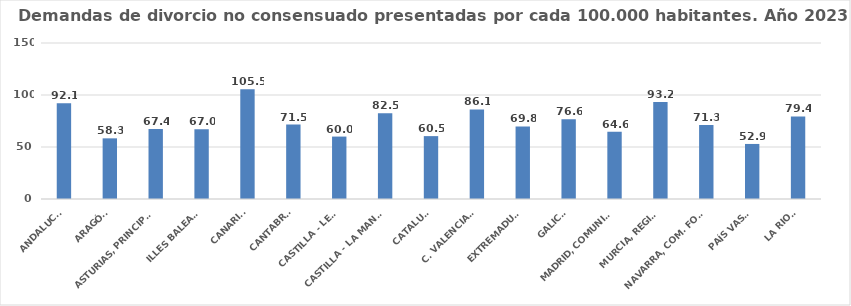
| Category | Series 0 |
|---|---|
| ANDALUCÍA | 92.074 |
| ARAGÓN | 58.325 |
| ASTURIAS, PRINCIPADO | 67.355 |
| ILLES BALEARS | 67.041 |
| CANARIAS | 105.517 |
| CANTABRIA | 71.534 |
| CASTILLA - LEÓN | 60.019 |
| CASTILLA - LA MANCHA | 82.523 |
| CATALUÑA | 60.463 |
| C. VALENCIANA | 86.121 |
| EXTREMADURA | 69.809 |
| GALICIA | 76.601 |
| MADRID, COMUNIDAD | 64.565 |
| MURCIA, REGIÓN | 93.193 |
| NAVARRA, COM. FORAL | 71.259 |
| PAÍS VASCO | 52.93 |
| LA RIOJA | 79.438 |